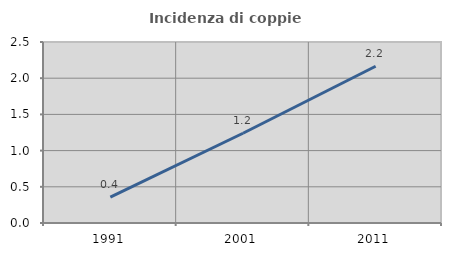
| Category | Incidenza di coppie miste |
|---|---|
| 1991.0 | 0.358 |
| 2001.0 | 1.24 |
| 2011.0 | 2.165 |